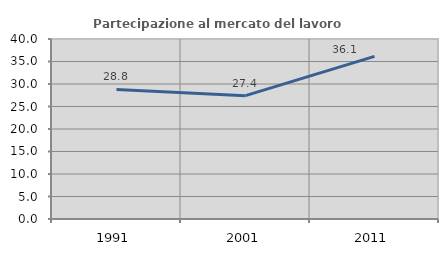
| Category | Partecipazione al mercato del lavoro  femminile |
|---|---|
| 1991.0 | 28.797 |
| 2001.0 | 27.407 |
| 2011.0 | 36.149 |